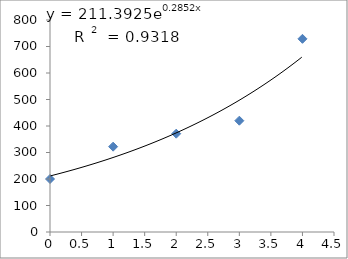
| Category | Series 0 |
|---|---|
| 0.0 | 200 |
| 1.0 | 322 |
| 2.0 | 371 |
| 3.0 | 420 |
| 4.0 | 729 |